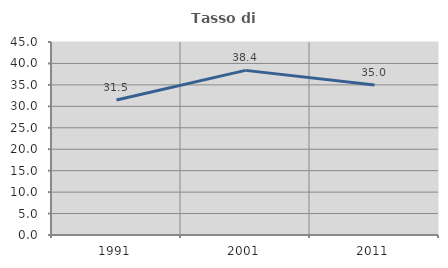
| Category | Tasso di occupazione   |
|---|---|
| 1991.0 | 31.489 |
| 2001.0 | 38.385 |
| 2011.0 | 35 |